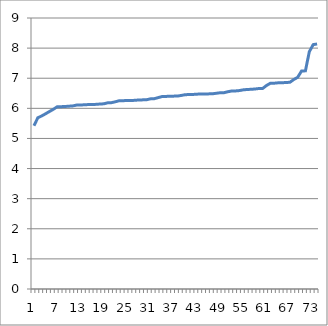
| Category | Series 0 |
|---|---|
| 0 | 5.422 |
| 1 | 5.685 |
| 2 | 5.748 |
| 3 | 5.819 |
| 4 | 5.895 |
| 5 | 5.968 |
| 6 | 6.053 |
| 7 | 6.055 |
| 8 | 6.061 |
| 9 | 6.071 |
| 10 | 6.08 |
| 11 | 6.108 |
| 12 | 6.11 |
| 13 | 6.118 |
| 14 | 6.125 |
| 15 | 6.128 |
| 16 | 6.132 |
| 17 | 6.143 |
| 18 | 6.15 |
| 19 | 6.183 |
| 20 | 6.189 |
| 21 | 6.218 |
| 22 | 6.253 |
| 23 | 6.254 |
| 24 | 6.26 |
| 25 | 6.262 |
| 26 | 6.265 |
| 27 | 6.278 |
| 28 | 6.281 |
| 29 | 6.285 |
| 30 | 6.314 |
| 31 | 6.32 |
| 32 | 6.355 |
| 33 | 6.39 |
| 34 | 6.395 |
| 35 | 6.403 |
| 36 | 6.405 |
| 37 | 6.408 |
| 38 | 6.428 |
| 39 | 6.453 |
| 40 | 6.458 |
| 41 | 6.461 |
| 42 | 6.47 |
| 43 | 6.478 |
| 44 | 6.479 |
| 45 | 6.48 |
| 46 | 6.482 |
| 47 | 6.5 |
| 48 | 6.517 |
| 49 | 6.519 |
| 50 | 6.551 |
| 51 | 6.576 |
| 52 | 6.578 |
| 53 | 6.59 |
| 54 | 6.615 |
| 55 | 6.626 |
| 56 | 6.632 |
| 57 | 6.642 |
| 58 | 6.658 |
| 59 | 6.662 |
| 60 | 6.762 |
| 61 | 6.835 |
| 62 | 6.835 |
| 63 | 6.848 |
| 64 | 6.85 |
| 65 | 6.858 |
| 66 | 6.865 |
| 67 | 6.957 |
| 68 | 7.03 |
| 69 | 7.24 |
| 70 | 7.245 |
| 71 | 7.88 |
| 72 | 8.116 |
| 73 | 8.138 |